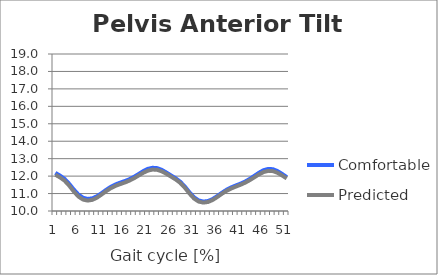
| Category | Comfortable | Predicted |
|---|---|---|
| 0 | 12.186 | 12.079 |
| 1 | 12.031 | 11.928 |
| 2 | 11.842 | 11.74 |
| 3 | 11.56 | 11.454 |
| 4 | 11.228 | 11.116 |
| 5 | 10.94 | 10.827 |
| 6 | 10.759 | 10.654 |
| 7 | 10.692 | 10.597 |
| 8 | 10.725 | 10.638 |
| 9 | 10.845 | 10.764 |
| 10 | 11.022 | 10.946 |
| 11 | 11.214 | 11.139 |
| 12 | 11.386 | 11.309 |
| 13 | 11.522 | 11.441 |
| 14 | 11.624 | 11.54 |
| 15 | 11.714 | 11.631 |
| 16 | 11.82 | 11.739 |
| 17 | 11.957 | 11.876 |
| 18 | 12.119 | 12.032 |
| 19 | 12.285 | 12.189 |
| 20 | 12.415 | 12.312 |
| 21 | 12.477 | 12.375 |
| 22 | 12.458 | 12.363 |
| 23 | 12.358 | 12.275 |
| 24 | 12.205 | 12.132 |
| 25 | 12.039 | 11.971 |
| 26 | 11.877 | 11.81 |
| 27 | 11.677 | 11.61 |
| 28 | 11.397 | 11.33 |
| 29 | 11.066 | 10.998 |
| 30 | 10.78 | 10.709 |
| 31 | 10.603 | 10.536 |
| 32 | 10.54 | 10.482 |
| 33 | 10.572 | 10.518 |
| 34 | 10.685 | 10.631 |
| 35 | 10.856 | 10.8 |
| 36 | 11.045 | 10.987 |
| 37 | 11.216 | 11.155 |
| 38 | 11.352 | 11.288 |
| 39 | 11.462 | 11.397 |
| 40 | 11.565 | 11.501 |
| 41 | 11.685 | 11.62 |
| 42 | 11.836 | 11.763 |
| 43 | 12.011 | 11.929 |
| 44 | 12.192 | 12.097 |
| 45 | 12.339 | 12.232 |
| 46 | 12.413 | 12.301 |
| 47 | 12.397 | 12.287 |
| 48 | 12.292 | 12.193 |
| 49 | 12.127 | 12.039 |
| 50 | 11.949 | 11.869 |